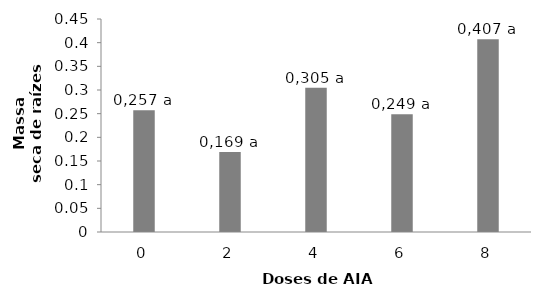
| Category | Series 0 |
|---|---|
| 0 | 0.257 |
| 1 | 0.169 |
| 2 | 0.305 |
| 3 | 0.249 |
| 4 | 0.407 |